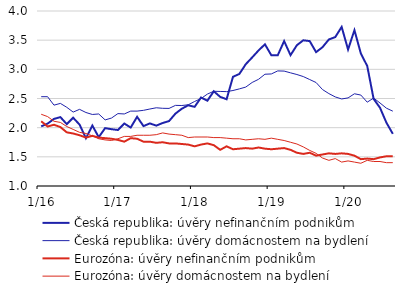
| Category | Česká republika: úvěry nefinančním podnikům | Česká republika: úvěry domácnostem na bydlení | Eurozóna: úvěry nefinančním podnikům | Eurozóna: úvěry domácnostem na bydlení |
|---|---|---|---|---|
|  1/16 | 2.022 | 2.531 | 2.11 | 2.23 |
| 2 | 2.069 | 2.531 | 2.02 | 2.19 |
| 3 | 2.15 | 2.386 | 2.05 | 2.11 |
| 4 | 2.181 | 2.416 | 2.01 | 2.09 |
| 5 | 2.061 | 2.349 | 1.92 | 2.02 |
| 6 | 2.17 | 2.267 | 1.9 | 1.97 |
| 7 | 2.053 | 2.314 | 1.87 | 1.92 |
| 8 | 1.819 | 2.26 | 1.83 | 1.9 |
| 9 | 2.037 | 2.226 | 1.86 | 1.86 |
| 10 | 1.837 | 2.235 | 1.83 | 1.81 |
| 11 | 1.992 | 2.133 | 1.82 | 1.79 |
| 12 | 1.974 | 2.165 | 1.81 | 1.78 |
|  1/17 | 1.96 | 2.241 | 1.79 | 1.81 |
| 2 | 2.071 | 2.235 | 1.76 | 1.85 |
| 3 | 2.002 | 2.284 | 1.82 | 1.85 |
| 4 | 2.186 | 2.284 | 1.81 | 1.87 |
| 5 | 2.027 | 2.297 | 1.76 | 1.87 |
| 6 | 2.073 | 2.32 | 1.76 | 1.87 |
| 7 | 2.035 | 2.341 | 1.74 | 1.88 |
| 8 | 2.08 | 2.332 | 1.75 | 1.91 |
| 9 | 2.113 | 2.33 | 1.73 | 1.89 |
| 10 | 2.241 | 2.382 | 1.73 | 1.88 |
| 11 | 2.325 | 2.38 | 1.72 | 1.87 |
| 12 | 2.384 | 2.392 | 1.71 | 1.83 |
|  1/18 | 2.357 | 2.449 | 1.68 | 1.84 |
| 2 | 2.517 | 2.499 | 1.71 | 1.84 |
| 3 | 2.463 | 2.576 | 1.73 | 1.84 |
| 4 | 2.624 | 2.624 | 1.7 | 1.83 |
| 5 | 2.528 | 2.621 | 1.62 | 1.83 |
| 6 | 2.487 | 2.618 | 1.68 | 1.82 |
| 7 | 2.872 | 2.637 | 1.63 | 1.81 |
| 8 | 2.921 | 2.665 | 1.64 | 1.81 |
| 9 | 3.088 | 2.696 | 1.65 | 1.79 |
| 10 | 3.204 | 2.775 | 1.64 | 1.8 |
| 11 | 3.324 | 2.829 | 1.66 | 1.81 |
| 12 | 3.429 | 2.916 | 1.64 | 1.8 |
|  1/19 | 3.241 | 2.921 | 1.63 | 1.82 |
| 2 | 3.241 | 2.973 | 1.64 | 1.8 |
| 3 | 3.484 | 2.97 | 1.65 | 1.78 |
| 4 | 3.243 | 2.94 | 1.62 | 1.75 |
| 5 | 3.414 | 2.911 | 1.57 | 1.72 |
| 6 | 3.498 | 2.876 | 1.55 | 1.67 |
| 7 | 3.484 | 2.825 | 1.57 | 1.61 |
| 8 | 3.295 | 2.774 | 1.52 | 1.56 |
| 9 | 3.379 | 2.654 | 1.54 | 1.48 |
| 10 | 3.512 | 2.584 | 1.56 | 1.44 |
| 11 | 3.553 | 2.527 | 1.55 | 1.47 |
| 12 | 3.727 | 2.492 | 1.56 | 1.41 |
|  1/20 | 3.34 | 2.51 | 1.55 | 1.43 |
| 2 | 3.671 | 2.581 | 1.52 | 1.41 |
| 3 | 3.272 | 2.559 | 1.46 | 1.39 |
| 4 | 3.057 | 2.437 | 1.47 | 1.44 |
| 5 | 2.493 | 2.508 | 1.46 | 1.42 |
| 6 | 2.341 | 2.423 | 1.49 | 1.42 |
| 7 | 2.086 | 2.334 | 1.51 | 1.4 |
| 8 | 1.894 | 2.283 | 1.51 | 1.4 |